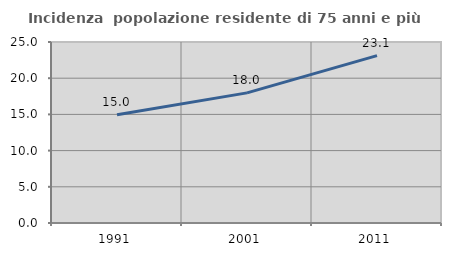
| Category | Incidenza  popolazione residente di 75 anni e più |
|---|---|
| 1991.0 | 14.965 |
| 2001.0 | 17.971 |
| 2011.0 | 23.12 |